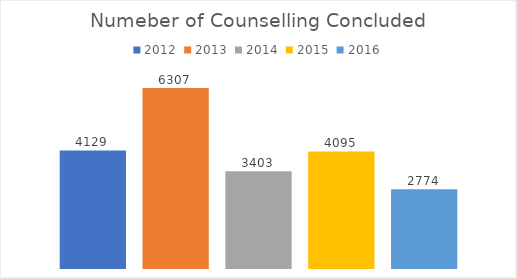
| Category | 2012 | 2013 | 2014 | 2015 | 2016 |
|---|---|---|---|---|---|
| 0 | 4129 | 6307 | 3403 | 4095 | 2774 |